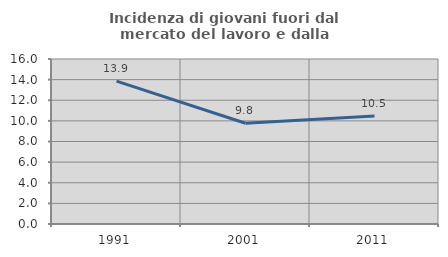
| Category | Incidenza di giovani fuori dal mercato del lavoro e dalla formazione  |
|---|---|
| 1991.0 | 13.855 |
| 2001.0 | 9.774 |
| 2011.0 | 10.465 |